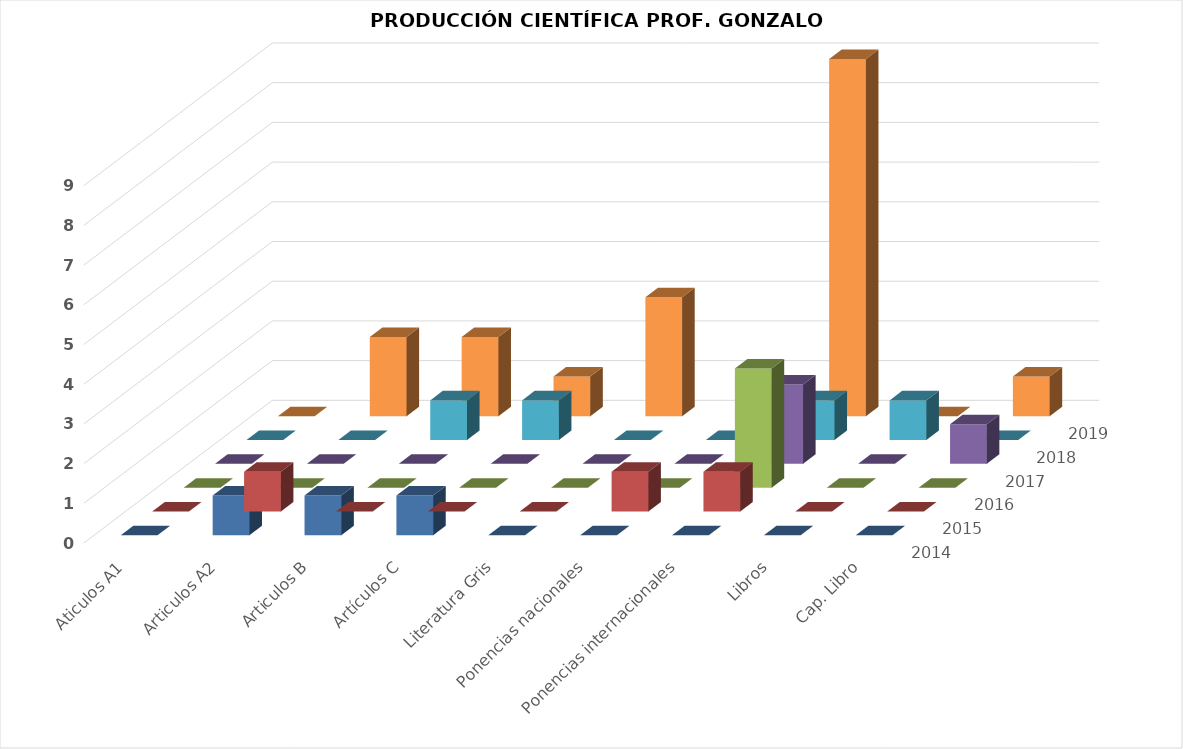
| Category | 2014 | 2015 | 2016 | 2017 | 2018 | 2019 |
|---|---|---|---|---|---|---|
| Aticulos A1 | 0 | 0 | 0 | 0 | 0 | 0 |
| Articulos A2 | 1 | 0 | 0 | 0 | 2 | 1 |
| Articulos B | 0 | 0 | 0 | 1 | 2 | 1 |
| Artículos C | 0 | 0 | 0 | 1 | 1 | 1 |
| Literatura Gris | 0 | 0 | 0 | 0 | 3 | 0 |
| Ponencias nacionales | 1 | 0 | 0 | 0 | 0 | 0 |
| Ponencias internacionales | 1 | 3 | 2 | 1 | 9 | 0 |
| Libros | 0 | 0 | 0 | 1 | 0 | 0 |
| Cap. Libro | 0 | 0 | 1 | 0 | 1 | 0 |